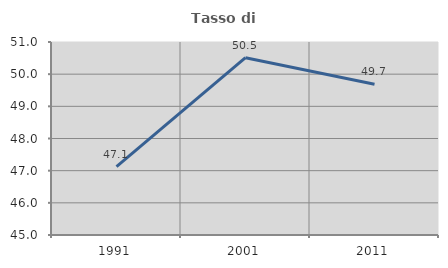
| Category | Tasso di occupazione   |
|---|---|
| 1991.0 | 47.125 |
| 2001.0 | 50.513 |
| 2011.0 | 49.686 |